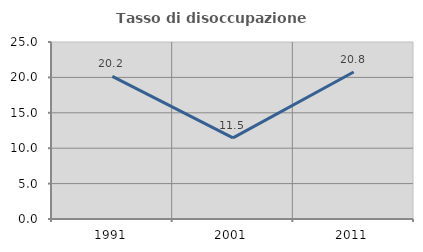
| Category | Tasso di disoccupazione giovanile  |
|---|---|
| 1991.0 | 20.15 |
| 2001.0 | 11.45 |
| 2011.0 | 20.769 |